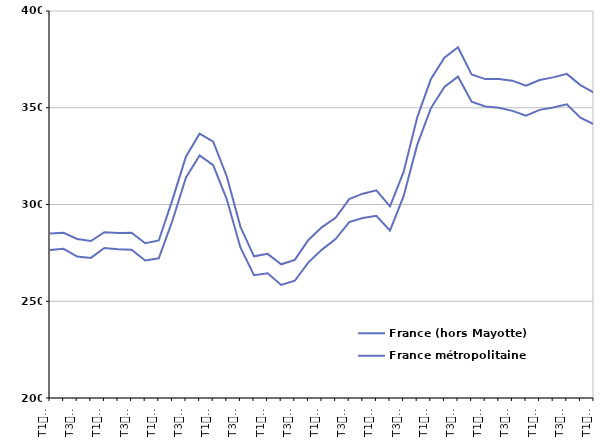
| Category | France (hors Mayotte) | France métropolitaine |
|---|---|---|
| T1
2014 | 285 | 276.5 |
| T2
2014 | 285.4 | 277.1 |
| T3
2014 | 282.2 | 273.1 |
| T4
2014 | 281.1 | 272.4 |
| T1
2015 | 285.7 | 277.5 |
| T2
2015 | 285.3 | 276.9 |
| T3
2015 | 285.4 | 276.6 |
| T4
2015 | 280 | 271.1 |
| T1
2016 | 281.4 | 272.2 |
| T2
2016 | 302.4 | 291.6 |
| T3
2016 | 324.8 | 314 |
| T4
2016 | 336.6 | 325.3 |
| T1
2017 | 332.5 | 320.3 |
| T2
2017 | 314.5 | 302.7 |
| T3
2017 | 288.6 | 277.8 |
| T4
2017 | 273.2 | 263.5 |
| T1
2018 | 274.5 | 264.5 |
| T2
2018 | 269.1 | 258.4 |
| T3
2018 | 271.4 | 260.6 |
| T4
2018 | 281.7 | 270.1 |
| T1
2019 | 288.3 | 276.7 |
| T2
2019 | 293.1 | 282.1 |
| T3
2019 | 302.8 | 290.9 |
| T4
2019 | 305.6 | 293 |
| T1
2020 | 307.3 | 294.2 |
| T2
2020 | 299 | 286.5 |
| T3
2020 | 316.8 | 304.3 |
| T4
2020 | 345 | 330.8 |
| T1
2021 | 364.7 | 349.7 |
| T2
2021 | 375.9 | 360.7 |
| T3
2021 | 381.3 | 366.1 |
| T4
2021 | 367.2 | 353.1 |
| T1
2022 | 364.8 | 350.7 |
| T2
2022 | 364.8 | 350 |
| T3
2022 | 364 | 348.4 |
| T4
2022 | 361.4 | 345.9 |
| T1
2023 | 364.3 | 348.9 |
| T2
2023 | 365.7 | 350.1 |
| T3
2023 | 367.5 | 351.8 |
| T4
2023 | 361.7 | 344.9 |
| T1
2024 | 357.8 | 341.4 |